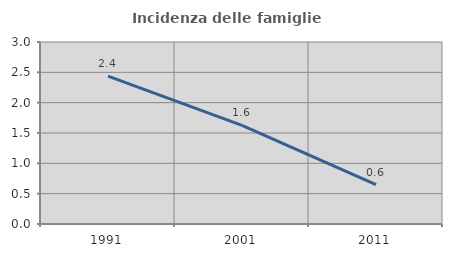
| Category | Incidenza delle famiglie numerose |
|---|---|
| 1991.0 | 2.436 |
| 2001.0 | 1.627 |
| 2011.0 | 0.649 |